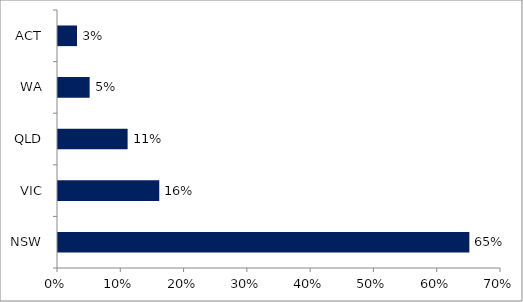
| Category | Series 0 |
|---|---|
| NSW | 0.65 |
| VIC | 0.16 |
| QLD | 0.11 |
| WA | 0.05 |
| ACT | 0.03 |